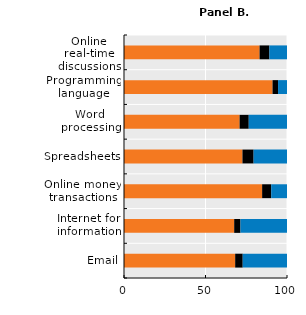
| Category | Never | Less than once a week | At least once a week |
|---|---|---|---|
| Email | 68.205 | 4.627 | 27.168 |
| Internet for information | 67.602 | 3.843 | 28.555 |
| Online money transactions | 84.744 | 5.576 | 9.679 |
| Spreadsheets | 72.675 | 6.841 | 20.484 |
| Word processing | 70.929 | 5.609 | 23.462 |
| Programming language | 91.125 | 3.389 | 5.486 |
| Online real-time discussions | 83.179 | 6.023 | 10.798 |